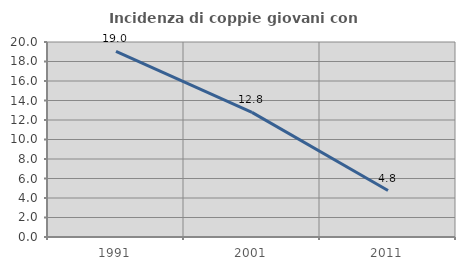
| Category | Incidenza di coppie giovani con figli |
|---|---|
| 1991.0 | 19.038 |
| 2001.0 | 12.784 |
| 2011.0 | 4.762 |